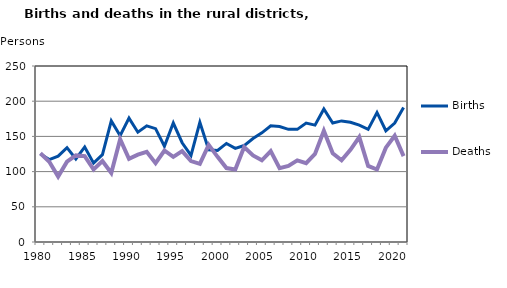
| Category | Births | Deaths |
|---|---|---|
| 1980.0 | 125 | 126 |
| 1981.0 | 117 | 114 |
| 1982.0 | 122 | 93 |
| 1983.0 | 134 | 114 |
| 1984.0 | 118 | 123 |
| 1985.0 | 135 | 122 |
| 1986.0 | 112 | 103 |
| 1987.0 | 124 | 115 |
| 1988.0 | 172 | 98 |
| 1989.0 | 151 | 146 |
| 1990.0 | 176 | 118 |
| 1991.0 | 156 | 124 |
| 1992.0 | 165 | 128 |
| 1993.0 | 161 | 112 |
| 1994.0 | 136 | 130 |
| 1995.0 | 169 | 121 |
| 1996.0 | 141 | 129 |
| 1997.0 | 123 | 115 |
| 1998.0 | 170 | 111 |
| 1999.0 | 131 | 138 |
| 2000.0 | 130 | 121 |
| 2001.0 | 140 | 105 |
| 2002.0 | 133 | 103 |
| 2003.0 | 137 | 135 |
| 2004.0 | 147 | 123 |
| 2005.0 | 155 | 116 |
| 2006.0 | 165 | 129 |
| 2007.0 | 164 | 105 |
| 2008.0 | 160 | 108 |
| 2009.0 | 160 | 116 |
| 2010.0 | 169 | 112 |
| 2011.0 | 166 | 125 |
| 2012.0 | 189 | 158 |
| 2013.0 | 169 | 126 |
| 2014.0 | 172 | 116 |
| 2015.0 | 170 | 131 |
| 2016.0 | 166 | 149 |
| 2017.0 | 160 | 108 |
| 2018.0 | 184 | 103 |
| 2019.0 | 158 | 134 |
| 2020.0 | 169 | 151 |
| 2021.0 | 191 | 122 |